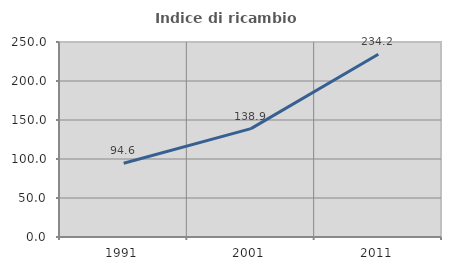
| Category | Indice di ricambio occupazionale  |
|---|---|
| 1991.0 | 94.595 |
| 2001.0 | 138.938 |
| 2011.0 | 234.222 |